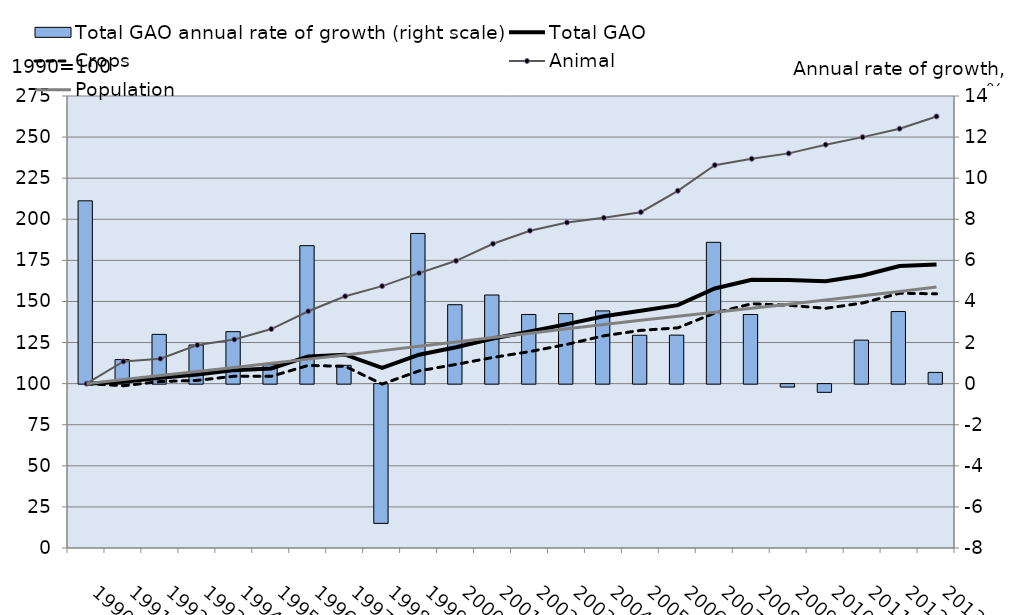
| Category | Total GAO annual rate of growth (right scale) |
|---|---|
|  1990 | 8.898 |
|  1991 | 1.169 |
|  1992 | 2.397 |
|  1993 | 1.881 |
|  1994 | 2.53 |
|  1995 | 0.92 |
|  1996 | 6.715 |
|  1997 | 0.892 |
|  1998 | -6.777 |
|  1999 | 7.309 |
|  2000 | 3.841 |
|  2001 | 4.314 |
|  2002 | 3.365 |
|  2003 | 3.409 |
|  2004 | 3.54 |
|  2005 | 2.355 |
|  2006 | 2.36 |
|  2007 | 6.879 |
|  2008 | 3.364 |
|  2009 | -0.142 |
|  2010 | -0.399 |
|  2011 | 2.116 |
|  2012 | 3.51 |
|  2013 | 0.547 |